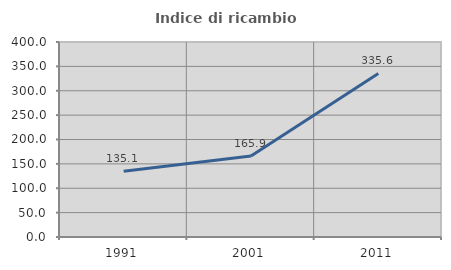
| Category | Indice di ricambio occupazionale  |
|---|---|
| 1991.0 | 135.081 |
| 2001.0 | 165.936 |
| 2011.0 | 335.556 |